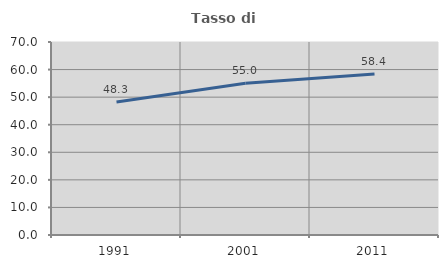
| Category | Tasso di occupazione   |
|---|---|
| 1991.0 | 48.256 |
| 2001.0 | 55.044 |
| 2011.0 | 58.431 |